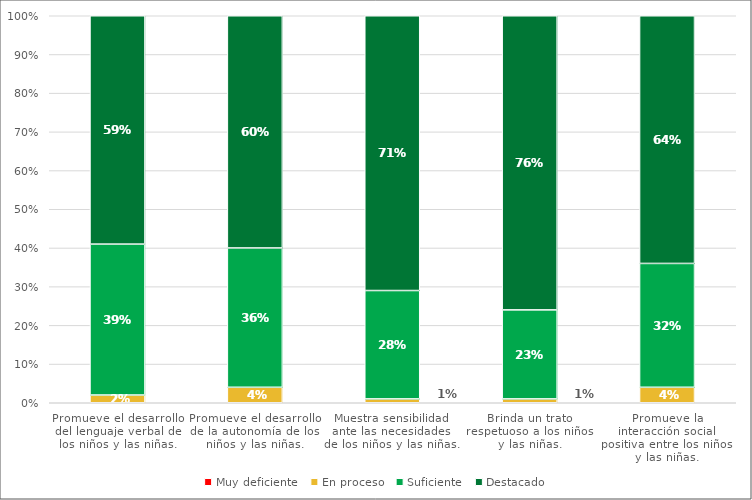
| Category | Muy deficiente | En proceso | Suficiente | Destacado |
|---|---|---|---|---|
| Promueve el desarrollo del lenguaje verbal de los niños y las niñas. | 0 | 0.02 | 0.39 | 0.59 |
| Promueve el desarrollo de la autonomía de los niños y las niñas. | 0 | 0.04 | 0.36 | 0.6 |
| Muestra sensibilidad ante las necesidades de los niños y las niñas. | 0 | 0.01 | 0.28 | 0.71 |
| Brinda un trato respetuoso a los niños y las niñas. | 0 | 0.01 | 0.23 | 0.76 |
| Promueve la interacción social positiva entre los niños y las niñas. | 0 | 0.04 | 0.32 | 0.64 |